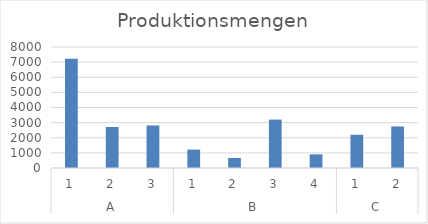
| Category | Umsatz |
|---|---|
| 0 | 7229 |
| 1 | 2710 |
| 2 | 2811 |
| 3 | 1216 |
| 4 | 666 |
| 5 | 3200 |
| 6 | 902 |
| 7 | 2197 |
| 8 | 2746 |